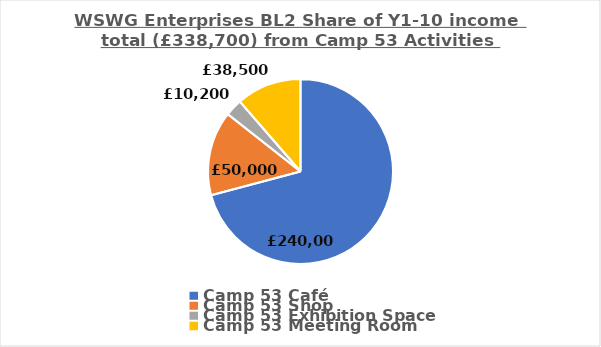
| Category | Series 0 |
|---|---|
| Camp 53 Café | 240000 |
| Camp 53 Shop | 50000 |
| Camp 53 Exhibition Space | 10200 |
| Camp 53 Meeting Room | 38500 |